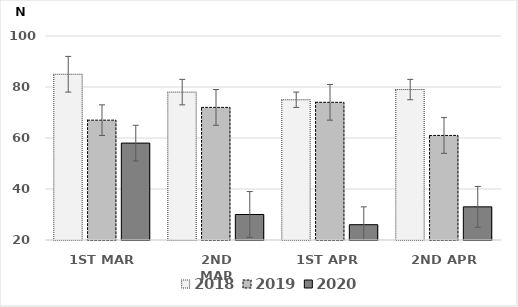
| Category | 2018 | 2019 | 2020 |
|---|---|---|---|
| 1ST MAR | 85 | 67 | 58 |
| 2ND MAR | 78 | 72 | 30 |
| 1ST APR | 75 | 74 | 26 |
| 2ND APR | 79 | 61 | 33 |